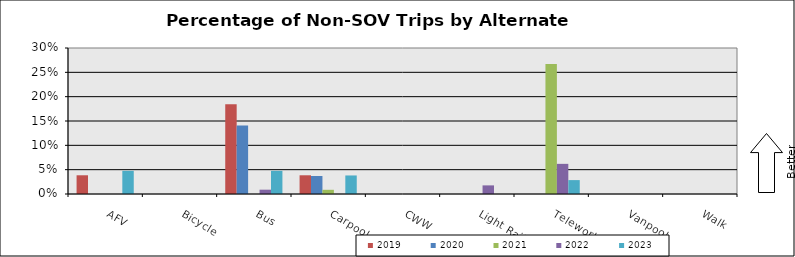
| Category | 2019 | 2020 | 2021 | 2022 | 2023 |
|---|---|---|---|---|---|
| AFV | 0.038 | 0 | 0 | 0 | 0.048 |
| Bicycle | 0 | 0 | 0 | 0 | 0 |
| Bus | 0.185 | 0.141 | 0 | 0.009 | 0.048 |
| Carpool | 0.038 | 0.037 | 0.009 | 0 | 0.038 |
| CWW | 0 | 0 | 0 | 0 | 0 |
| Light Rail | 0 | 0 | 0 | 0.018 | 0 |
| Telework | 0 | 0 | 0.267 | 0.062 | 0.029 |
| Vanpool | 0 | 0 | 0 | 0 | 0 |
| Walk | 0 | 0 | 0 | 0 | 0 |